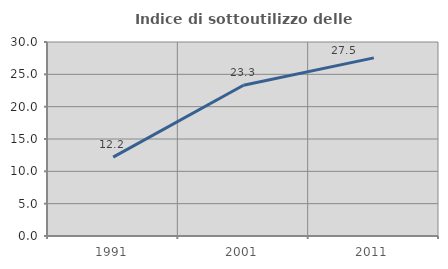
| Category | Indice di sottoutilizzo delle abitazioni  |
|---|---|
| 1991.0 | 12.2 |
| 2001.0 | 23.319 |
| 2011.0 | 27.542 |